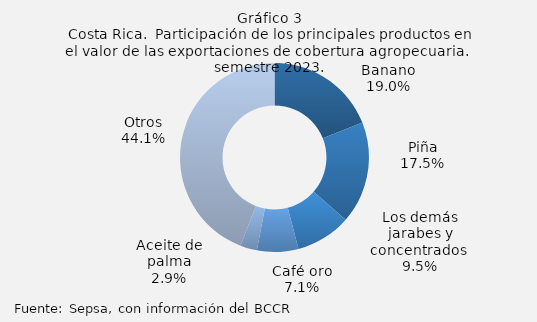
| Category | Series 0 |
|---|---|
| Banano | 624415.621 |
| Piña | 574369.44 |
| Los demás jarabes y concentrados  | 311610.984 |
| Café oro | 232868.023 |
| Aceite de palma | 94330.099 |
| Otros | 1452279.739 |